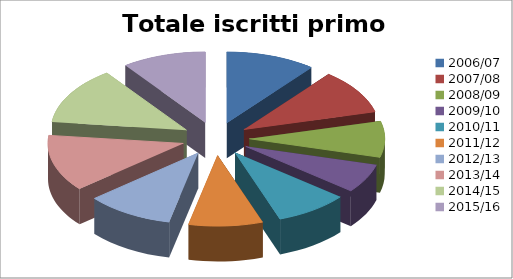
| Category | Totale iscritti primo anno | Alunni ripetenti | F.ripetenti | M.ripetenti |
|---|---|---|---|---|
| 2006/07 | 154 | 15 | 7 | 8 |
| 2007/08 | 147 | 22 | 8 | 14 |
| 2008/09 | 119 | 20 | 9 | 11 |
| 2009/10 | 95 | 19 | 6 | 13 |
| 2010/11 | 126 | 9 | 1 | 8 |
| 2011/12 | 127 | 30 | 15 | 15 |
| 2012/13 | 150 | 35 | 15 | 20 |
| 2013/14 | 186 | 35 | 13 | 22 |
| 2014/15 | 189 | 46 | 18 | 28 |
| 2015/16 | 144 | 46 | 23 | 23 |